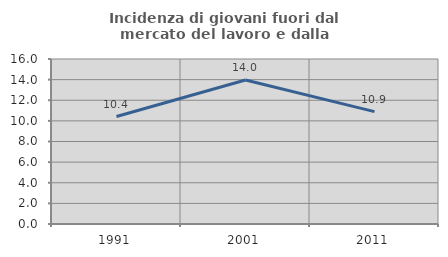
| Category | Incidenza di giovani fuori dal mercato del lavoro e dalla formazione  |
|---|---|
| 1991.0 | 10.422 |
| 2001.0 | 13.962 |
| 2011.0 | 10.895 |